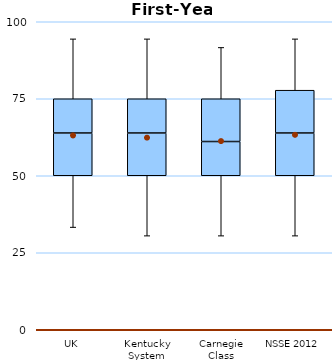
| Category | 25th | 50th | 75th |
|---|---|---|---|
| UK | 50 | 13.889 | 11.111 |
| Kentucky System | 50 | 13.889 | 11.111 |
| Carnegie Class | 50 | 11.111 | 13.889 |
| NSSE 2012 | 50 | 13.889 | 13.889 |